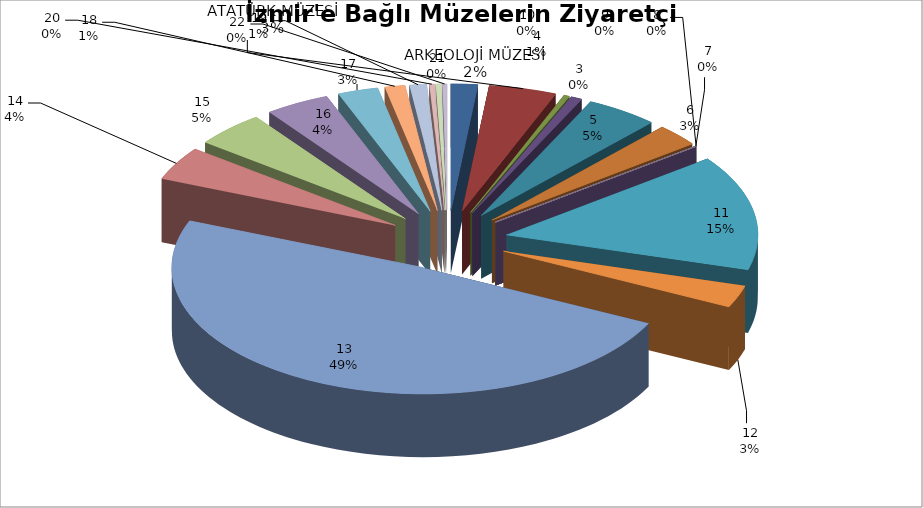
| Category | Series 0 |
|---|---|
| 0 | 33503 |
| 1 | 84758 |
| 2 | 7181 |
| 3 | 14083 |
| 4 | 91142 |
| 5 | 55547 |
| 6 | 846 |
| 7 | 0 |
| 8 | 0 |
| 9 | 0 |
| 10 | 287060 |
| 11 | 55167 |
| 12 | 950234 |
| 13 | 83884 |
| 14 | 88817 |
| 15 | 81066 |
| 16 | 50619 |
| 17 | 25315 |
| 18 | 21322 |
| 19 | 6307 |
| 20 | 6876 |
| 21 | 5609 |